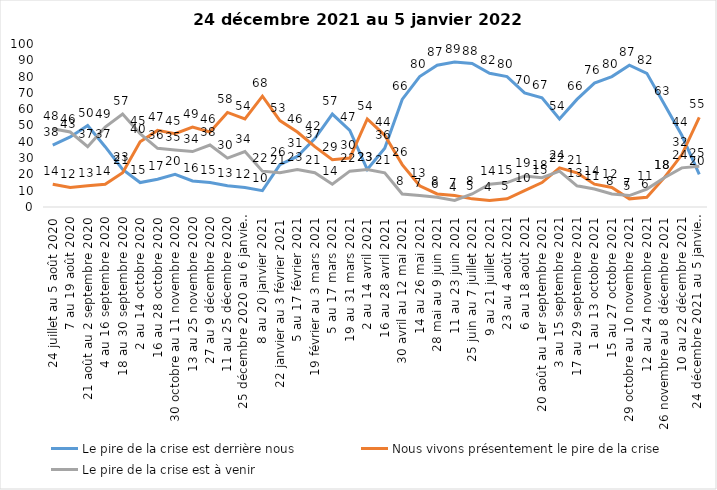
| Category | Le pire de la crise est derrière nous | Nous vivons présentement le pire de la crise | Le pire de la crise est à venir |
|---|---|---|---|
| 24 juillet au 5 août 2020 | 38 | 14 | 48 |
| 7 au 19 août 2020 | 43 | 12 | 46 |
| 21 août au 2 septembre 2020 | 50 | 13 | 37 |
| 4 au 16 septembre 2020 | 37 | 14 | 49 |
| 18 au 30 septembre 2020 | 23 | 21 | 57 |
| 2 au 14 octobre 2020 | 15 | 40 | 45 |
| 16 au 28 octobre 2020 | 17 | 47 | 36 |
| 30 octobre au 11 novembre 2020 | 20 | 45 | 35 |
| 13 au 25 novembre 2020 | 16 | 49 | 34 |
| 27 au 9 décembre 2020 | 15 | 46 | 38 |
| 11 au 25 décembre 2020 | 13 | 58 | 30 |
| 25 décembre 2020 au 6 janvier 2021 | 12 | 54 | 34 |
| 8 au 20 janvier 2021 | 10 | 68 | 22 |
| 22 janvier au 3 février 2021 | 26 | 53 | 21 |
| 5 au 17 février 2021 | 31 | 46 | 23 |
| 19 février au 3 mars 2021 | 42 | 37 | 21 |
| 5 au 17 mars 2021 | 57 | 29 | 14 |
| 19 au 31 mars 2021 | 47 | 30 | 22 |
| 2 au 14 avril 2021 | 23 | 54 | 23 |
| 16 au 28 avril 2021 | 36 | 44 | 21 |
| 30 avril au 12 mai 2021 | 66 | 26 | 8 |
| 14 au 26 mai 2021 | 80 | 13 | 7 |
| 28 mai au 9 juin 2021 | 87 | 8 | 6 |
| 11 au 23 juin 2021 | 89 | 7 | 4 |
| 25 juin au 7 juillet 2021 | 88 | 5 | 8 |
| 9 au 21 juillet 2021 | 82 | 4 | 14 |
| 23 au 4 août 2021 | 80 | 5 | 15 |
| 6 au 18 août 2021 | 70 | 10 | 19 |
| 20 août au 1er septembre 2021 | 67 | 15 | 18 |
| 3 au 15 septembre 2021 | 54 | 24 | 22 |
| 17 au 29 septembre 2021 | 66 | 21 | 13 |
| 1 au 13 octobre 2021 | 76 | 14 | 11 |
| 15 au 27 octobre 2021 | 80 | 12 | 8 |
| 29 octobre au 10 novembre 2021 | 87 | 5 | 7 |
| 12 au 24 novembre 2021 | 82 | 6 | 11 |
| 26 novembre au 8 décembre 2021 | 63 | 18 | 18 |
| 10 au 22 décembre 2021 | 44 | 32 | 24 |
| 24 décembre 2021 au 5 janvier 2022 2022 | 20 | 55 | 25 |